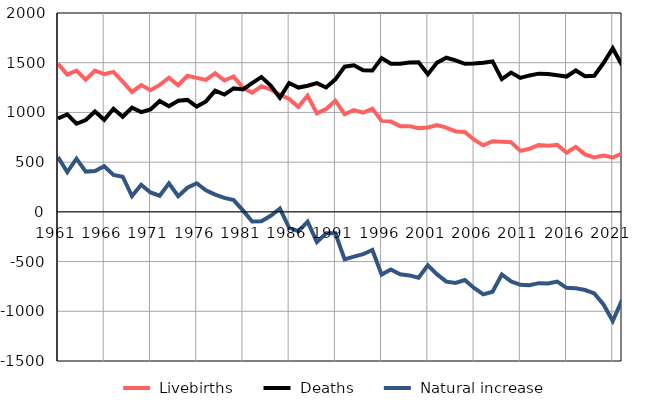
| Category |  Livebirths |  Deaths |  Natural increase |
|---|---|---|---|
| 1961.0 | 1489 | 939 | 550 |
| 1962.0 | 1381 | 981 | 400 |
| 1963.0 | 1421 | 886 | 535 |
| 1964.0 | 1329 | 924 | 405 |
| 1965.0 | 1421 | 1010 | 411 |
| 1966.0 | 1385 | 926 | 459 |
| 1967.0 | 1408 | 1037 | 371 |
| 1968.0 | 1310 | 957 | 353 |
| 1969.0 | 1206 | 1047 | 159 |
| 1970.0 | 1275 | 1003 | 272 |
| 1971.0 | 1224 | 1029 | 195 |
| 1972.0 | 1277 | 1115 | 162 |
| 1973.0 | 1349 | 1062 | 287 |
| 1974.0 | 1274 | 1117 | 157 |
| 1975.0 | 1369 | 1126 | 243 |
| 1976.0 | 1347 | 1059 | 288 |
| 1977.0 | 1327 | 1111 | 216 |
| 1978.0 | 1393 | 1219 | 174 |
| 1979.0 | 1321 | 1180 | 141 |
| 1980.0 | 1361 | 1243 | 118 |
| 1981.0 | 1246 | 1231 | 15 |
| 1982.0 | 1198 | 1295 | -97 |
| 1983.0 | 1263 | 1357 | -94 |
| 1984.0 | 1231 | 1271 | -40 |
| 1985.0 | 1179 | 1147 | 32 |
| 1986.0 | 1136 | 1296 | -160 |
| 1987.0 | 1056 | 1250 | -194 |
| 1988.0 | 1170 | 1269 | -99 |
| 1989.0 | 991 | 1295 | -304 |
| 1990.0 | 1035 | 1251 | -216 |
| 1991.0 | 1118 | 1333 | -215 |
| 1992.0 | 982 | 1460 | -478 |
| 1993.0 | 1024 | 1474 | -450 |
| 1994.0 | 997 | 1423 | -426 |
| 1995.0 | 1038 | 1421 | -383 |
| 1996.0 | 915 | 1546 | -631 |
| 1997.0 | 910 | 1490 | -580 |
| 1998.0 | 862 | 1489 | -627 |
| 1999.0 | 862 | 1501 | -639 |
| 2000.0 | 842 | 1505 | -663 |
| 2001.0 | 848 | 1385 | -537 |
| 2002.0 | 872 | 1501 | -629 |
| 2003.0 | 848 | 1550 | -702 |
| 2004.0 | 809 | 1524 | -715 |
| 2005.0 | 803 | 1489 | -686 |
| 2006.0 | 726 | 1491 | -765 |
| 2007.0 | 669 | 1499 | -830 |
| 2008.0 | 710 | 1513 | -803 |
| 2009.0 | 705 | 1335 | -630 |
| 2010.0 | 701 | 1401 | -700 |
| 2011.0 | 613 | 1347 | -734 |
| 2012.0 | 635 | 1372 | -737 |
| 2013.0 | 673 | 1390 | -717 |
| 2014.0 | 666 | 1387 | -721 |
| 2015.0 | 674 | 1375 | -701 |
| 2016.0 | 597 | 1361 | -764 |
| 2017.0 | 653 | 1422 | -769 |
| 2018.0 | 578 | 1364 | -786 |
| 2019.0 | 548 | 1369 | -821 |
| 2020.0 | 566 | 1497 | -931 |
| 2021.0 | 547 | 1645 | -1098 |
| 2022.0 | 588 | 1475 | -887 |